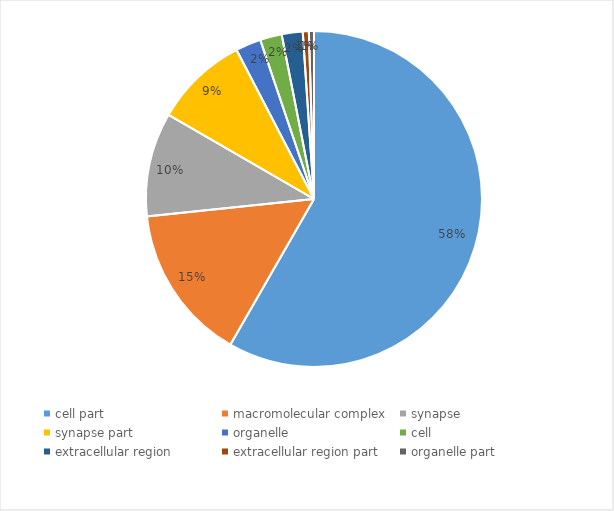
| Category | Series 0 |
|---|---|
| cell part  | 58.295 |
| macromolecular complex | 15.05 |
| synapse  | 10.002 |
| synapse part | 9.024 |
| organelle | 2.446 |
| cell | 2.092 |
| extracellular region | 2.019 |
| extracellular region part | 0.583 |
| organelle part | 0.489 |